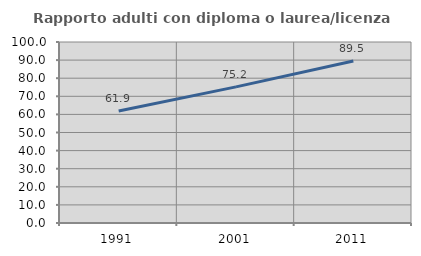
| Category | Rapporto adulti con diploma o laurea/licenza media  |
|---|---|
| 1991.0 | 61.905 |
| 2001.0 | 75.207 |
| 2011.0 | 89.474 |